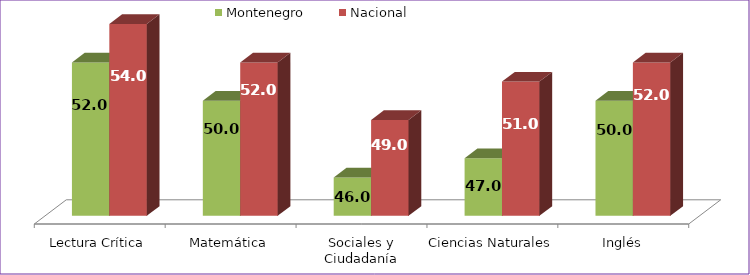
| Category | Montenegro | Nacional |
|---|---|---|
| Lectura Crítica | 52 | 54 |
| Matemática | 50 | 52 |
| Sociales y Ciudadanía | 46 | 49 |
| Ciencias Naturales | 47 | 51 |
| Inglés | 50 | 52 |